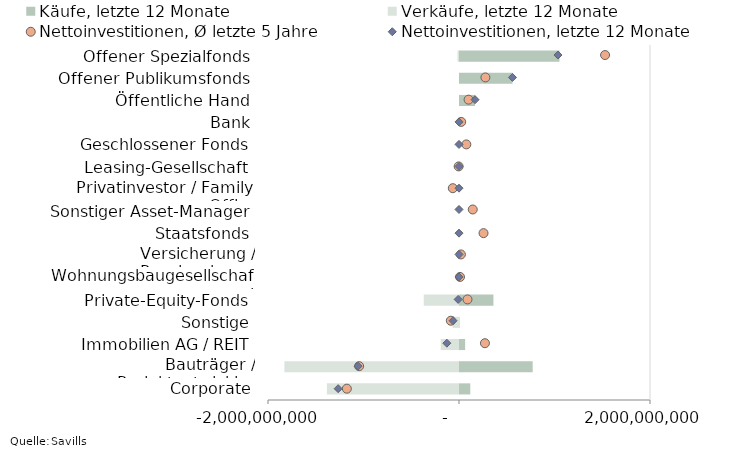
| Category | Käufe, letzte 12 Monate | Verkäufe, letzte 12 Monate |
|---|---|---|
| Corporate | 118120831 | -1383422163 |
| Bauträger / Projektentwickler | 771378900 | -1828513627.95 |
| Immobilien AG / REIT | 64212000 | -191350400 |
| Sonstige | 4999999 | -67198079 |
| Private-Equity-Fonds | 360465999 | -369408029.97 |
| Wohnungsbaugesellschaft | 0 | 0 |
| Versicherung / Pensionskasse | 0 | 0 |
| Staatsfonds | 0 | 0 |
| Sonstiger Asset-Manager | 0 | 0 |
| Privatinvestor / Family Office | 0 | 0 |
| Leasing-Gesellschaft | 0 | 0 |
| Geschlossener Fonds | 0 | 0 |
| Bank | 0 | 0 |
| Öffentliche Hand | 168159120 | -90000 |
| Offener Publikumsfonds | 559999999.97 | 0 |
| Offener Spezialfonds | 1052163640.98 | -15649500 |